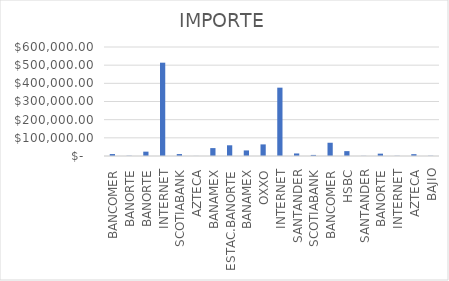
| Category | IMPORTE |
|---|---|
| BANCOMER | 10682.17 |
| BANORTE | 1412.1 |
| BANORTE | 23931.58 |
| INTERNET | 513669.19 |
| SCOTIABANK | 10578.27 |
| AZTECA | 409.72 |
| BANAMEX | 43506.55 |
| ESTAC.BANORTE | 58967.05 |
| BANAMEX | 30683.38 |
| OXXO | 63890.14 |
| INTERNET | 376173.22 |
| SANTANDER | 13983.07 |
| SCOTIABANK | 5900.33 |
| BANCOMER | 72945.39 |
| HSBC | 26817.4 |
| SANTANDER | 783.62 |
| BANORTE | 12901.59 |
| INTERNET | 1096 |
| AZTECA | 10089.85 |
| BAJIO | 1215.45 |